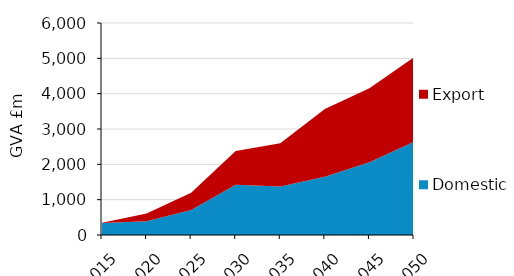
| Category | Domestic | Export |
|---|---|---|
| 2015.0 | 336.122 | 14.113 |
| 2020.0 | 391.36 | 218.539 |
| 2025.0 | 706.534 | 491.256 |
| 2030.0 | 1422.245 | 954.015 |
| 2035.0 | 1374.427 | 1222.385 |
| 2040.0 | 1646.271 | 1919.51 |
| 2045.0 | 2055.699 | 2098.283 |
| 2050.0 | 2640.772 | 2387.785 |